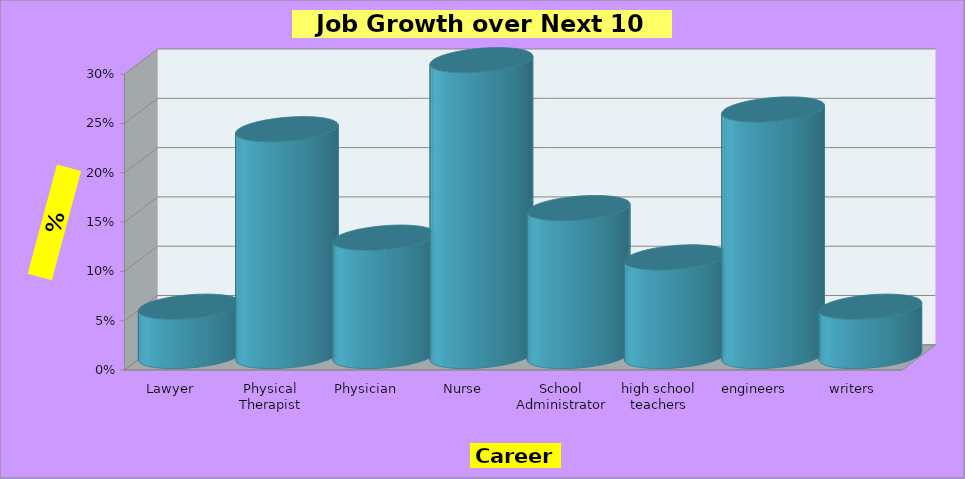
| Category | Lawyer Physical Therapist Physician Nurse School Administrator high school teachers engineers writers |
|---|---|
| Lawyer | 0.05 |
| Physical Therapist | 0.23 |
| Physician | 0.12 |
| Nurse | 0.3 |
| School Administrator | 0.15 |
| high school teachers | 0.1 |
| engineers | 0.25 |
| writers | 0.05 |